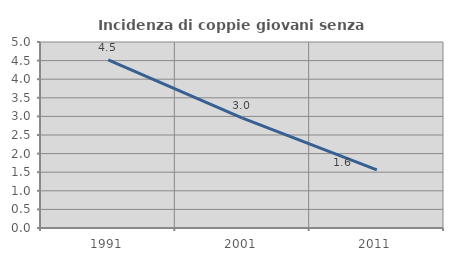
| Category | Incidenza di coppie giovani senza figli |
|---|---|
| 1991.0 | 4.521 |
| 2001.0 | 2.951 |
| 2011.0 | 1.562 |